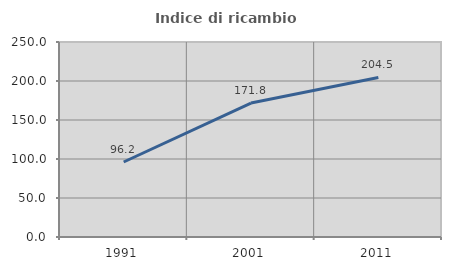
| Category | Indice di ricambio occupazionale  |
|---|---|
| 1991.0 | 96.165 |
| 2001.0 | 171.775 |
| 2011.0 | 204.529 |